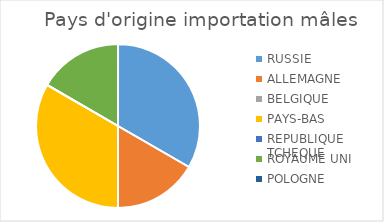
| Category | Series 0 |
|---|---|
| RUSSIE | 2 |
| ALLEMAGNE | 1 |
| BELGIQUE | 0 |
| PAYS-BAS | 2 |
| REPUBLIQUE TCHEQUE | 0 |
| ROYAUME UNI | 1 |
| POLOGNE | 0 |